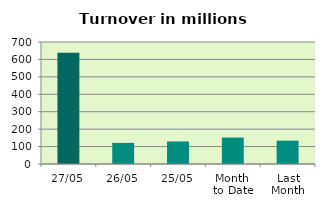
| Category | Series 0 |
|---|---|
| 27/05 | 638.321 |
| 26/05 | 121.119 |
| 25/05 | 129.42 |
| Month 
to Date | 151.597 |
| Last
Month | 133.981 |